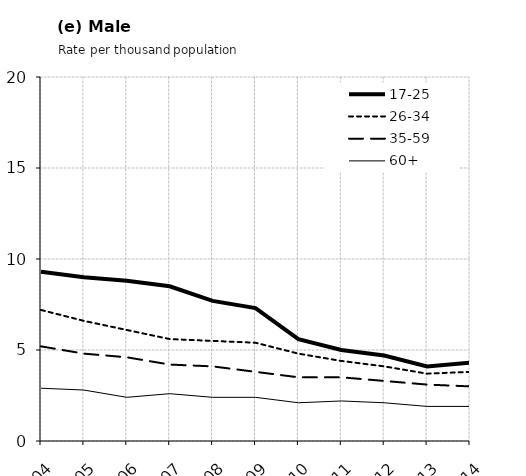
| Category | 17-25 | 26-34 | 35-59 | 60+ |
|---|---|---|---|---|
| 2004.0 | 9.3 | 7.2 | 5.2 | 2.9 |
| 2005.0 | 9 | 6.6 | 4.8 | 2.8 |
| 2006.0 | 8.8 | 6.1 | 4.6 | 2.4 |
| 2007.0 | 8.5 | 5.6 | 4.2 | 2.6 |
| 2008.0 | 7.7 | 5.5 | 4.1 | 2.4 |
| 2009.0 | 7.3 | 5.4 | 3.8 | 2.4 |
| 2010.0 | 5.6 | 4.8 | 3.5 | 2.1 |
| 2011.0 | 5 | 4.4 | 3.5 | 2.2 |
| 2012.0 | 4.7 | 4.1 | 3.3 | 2.1 |
| 2013.0 | 4.1 | 3.7 | 3.1 | 1.9 |
| 2014.0 | 4.3 | 3.8 | 3 | 1.9 |